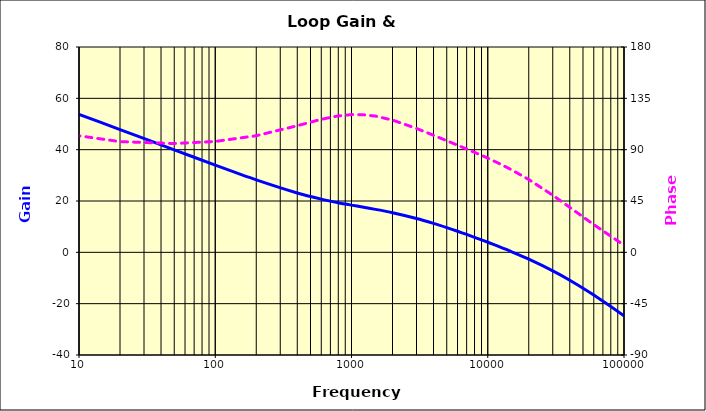
| Category | Gain |
|---|---|
| 1.0 | 66.76 |
| 2.0 | 64.775 |
| 5.0 | 59.251 |
| 10.0 | 53.724 |
| 20.0 | 47.839 |
| 50.0 | 39.938 |
| 100.0 | 33.994 |
| 200.0 | 28.245 |
| 400.0 | 23.136 |
| 600.0 | 20.737 |
| 800.0 | 19.342 |
| 1000.0 | 18.391 |
| 1200.0 | 17.654 |
| 1500.0 | 16.739 |
| 2000.0 | 15.436 |
| 3000.0 | 13.193 |
| 4000.0 | 11.284 |
| 5000.0 | 9.645 |
| 6000.0 | 8.222 |
| 7000.0 | 6.97 |
| 8000.0 | 5.852 |
| 9000.0 | 4.842 |
| 10000.0 | 3.921 |
| 12000.0 | 2.283 |
| 15000.0 | 0.193 |
| 20000.0 | -2.678 |
| 30000.0 | -7.202 |
| 40000.0 | -10.848 |
| 60000.0 | -16.627 |
| 100000.0 | -24.76 |
| 200000.0 | -36.798 |